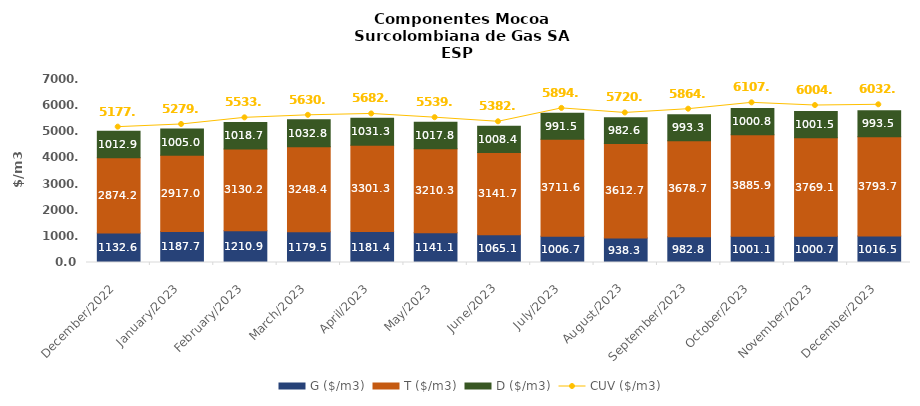
| Category | G ($/m3) | T ($/m3) | D ($/m3) |
|---|---|---|---|
| 2022-12-01 | 1132.64 | 2874.17 | 1012.88 |
| 2023-01-01 | 1187.7 | 2917.03 | 1005.02 |
| 2023-02-01 | 1210.89 | 3130.19 | 1018.71 |
| 2023-03-01 | 1179.48 | 3248.44 | 1032.83 |
| 2023-04-01 | 1181.36 | 3301.34 | 1031.34 |
| 2023-05-01 | 1141.05 | 3210.28 | 1017.81 |
| 2023-06-01 | 1065.07 | 3141.65 | 1008.39 |
| 2023-07-01 | 1006.71 | 3711.61 | 991.5 |
| 2023-08-01 | 938.29 | 3612.73 | 982.58 |
| 2023-09-01 | 982.76 | 3678.68 | 993.3 |
| 2023-10-01 | 1001.11 | 3885.88 | 1000.84 |
| 2023-11-01 | 1000.74 | 3769.12 | 1001.53 |
| 2023-12-01 | 1016.49 | 3793.69 | 993.53 |